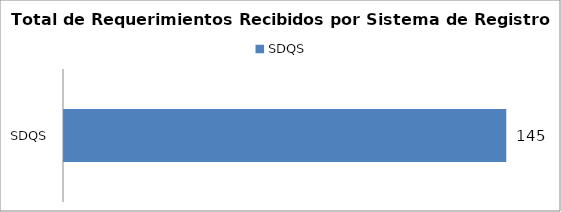
| Category | Total |
|---|---|
| SDQS | 145 |